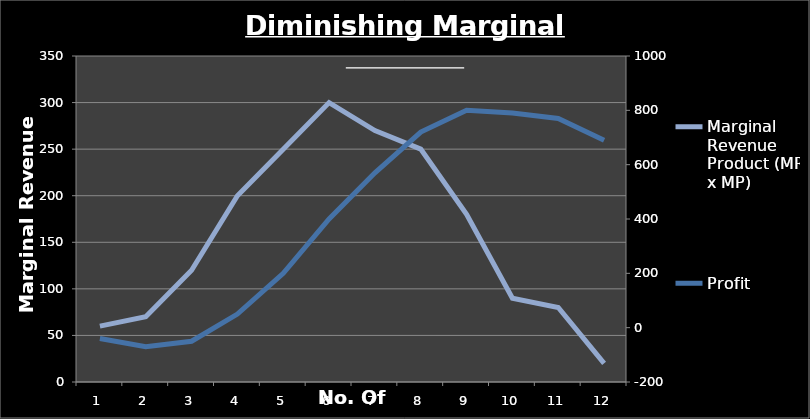
| Category | Marginal Revenue Product (MR x MP) |
|---|---|
| 0 | 60 |
| 1 | 70 |
| 2 | 120 |
| 3 | 200 |
| 4 | 250 |
| 5 | 300 |
| 6 | 270 |
| 7 | 250 |
| 8 | 180 |
| 9 | 90 |
| 10 | 80 |
| 11 | 20 |